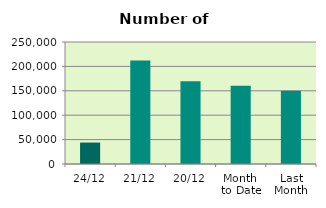
| Category | Series 0 |
|---|---|
| 24/12 | 43948 |
| 21/12 | 212106 |
| 20/12 | 169494 |
| Month 
to Date | 160202.375 |
| Last
Month | 150008.364 |